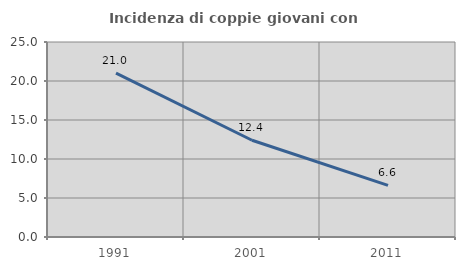
| Category | Incidenza di coppie giovani con figli |
|---|---|
| 1991.0 | 21.021 |
| 2001.0 | 12.407 |
| 2011.0 | 6.617 |